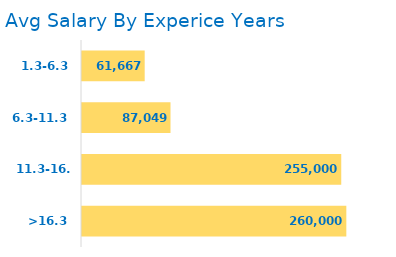
| Category | Avg Salary By Experice Years |
|---|---|
| 1.3-6.3 | 61666.667 |
| 6.3-11.3 | 87049.18 |
| 11.3-16.3 | 255000 |
| >16.3 | 260000 |